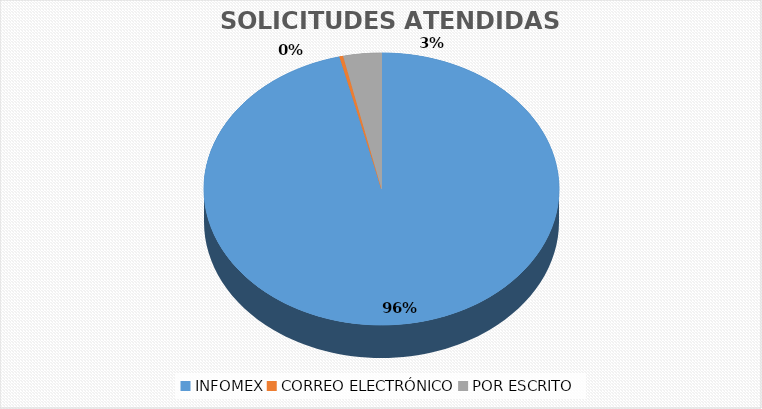
| Category | Series 0 |
|---|---|
| INFOMEX | 1136 |
| CORREO ELECTRÓNICO | 4 |
| POR ESCRITO | 41 |